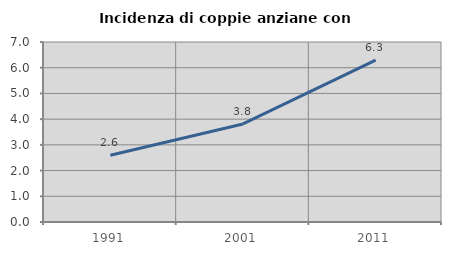
| Category | Incidenza di coppie anziane con figli |
|---|---|
| 1991.0 | 2.597 |
| 2001.0 | 3.814 |
| 2011.0 | 6.296 |